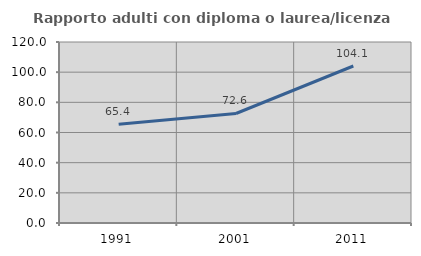
| Category | Rapporto adulti con diploma o laurea/licenza media  |
|---|---|
| 1991.0 | 65.437 |
| 2001.0 | 72.598 |
| 2011.0 | 104.082 |